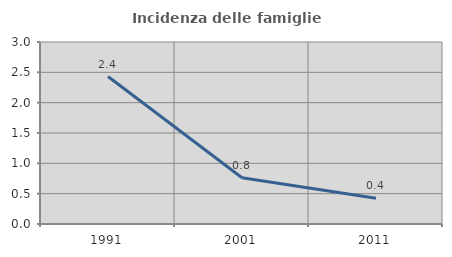
| Category | Incidenza delle famiglie numerose |
|---|---|
| 1991.0 | 2.43 |
| 2001.0 | 0.762 |
| 2011.0 | 0.424 |